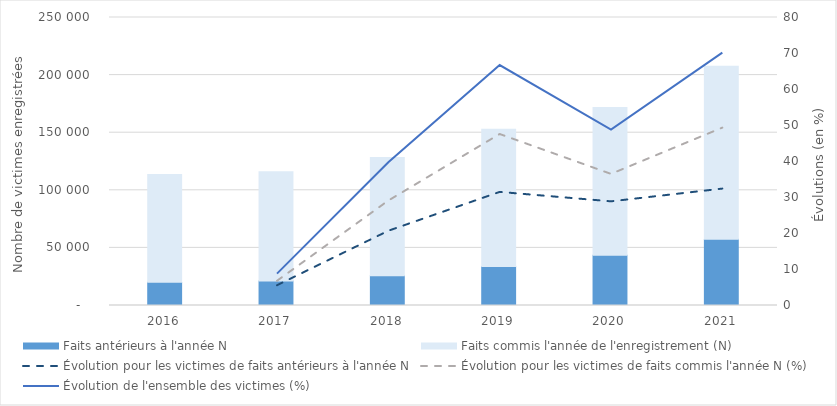
| Category | Faits antérieurs à l'année N | Faits commis l'année de l'enregistrement (N) |
|---|---|---|
| 2016 | 20211 | 93567 |
| 2017 | 21322 | 94718 |
| 2018 | 25720 | 102666 |
| 2019 | 33800 | 119181 |
| 2020 | 43533 | 128268 |
| 2021 | 57611 | 149989 |